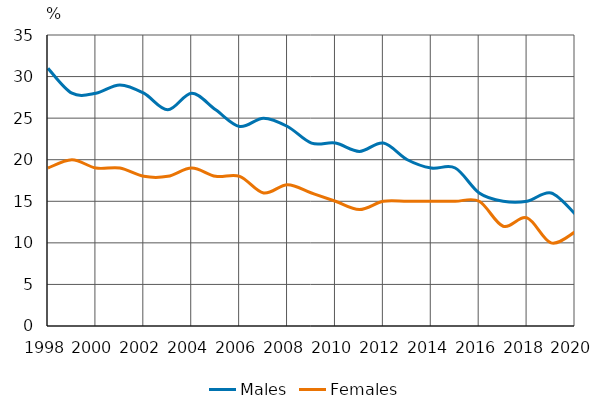
| Category | Males | Females |
|---|---|---|
| 1998.0 | 31 | 19 |
| 1999.0 | 28 | 20 |
| 2000.0 | 28 | 19 |
| 2001.0 | 29 | 19 |
| 2002.0 | 28 | 18 |
| 2003.0 | 26 | 18 |
| 2004.0 | 28 | 19 |
| 2005.0 | 26 | 18 |
| 2006.0 | 24 | 18 |
| 2007.0 | 25 | 16 |
| 2008.0 | 24 | 17 |
| 2009.0 | 22 | 16 |
| 2010.0 | 22 | 15 |
| 2011.0 | 21 | 14 |
| 2012.0 | 22 | 15 |
| 2013.0 | 20 | 15 |
| 2014.0 | 19 | 15 |
| 2015.0 | 19 | 15 |
| 2016.0 | 16 | 15 |
| 2017.0 | 15 | 12 |
| 2018.0 | 15 | 13 |
| 2019.0 | 16 | 10 |
| 2020.0 | 13.5 | 11.3 |